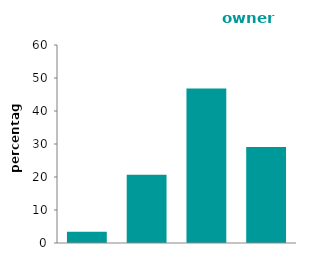
| Category | owner occupied |
|---|---|
| one | 3.38 |
| two | 20.671 |
| three | 46.842 |
| four or 
over | 29.107 |